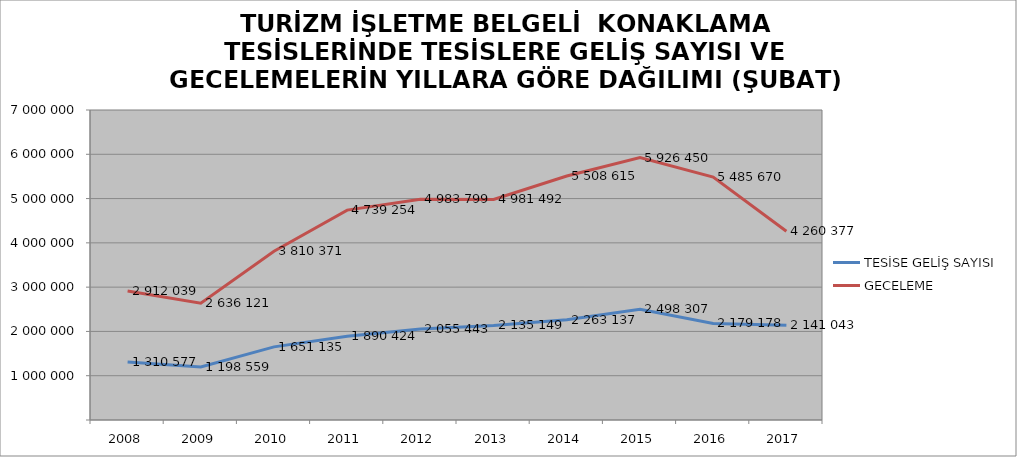
| Category | TESİSE GELİŞ SAYISI | GECELEME |
|---|---|---|
| 2008 | 1310577 | 2912039 |
| 2009 | 1198559 | 2636121 |
| 2010 | 1651135 | 3810371 |
| 2011 | 1890424 | 4739254 |
| 2012 | 2055443 | 4983799 |
| 2013 | 2135149 | 4981492 |
| 2014 | 2263137 | 5508615 |
| 2015 | 2498307 | 5926450 |
| 2016 | 2179178 | 5485670 |
| 2017 | 2141043 | 4260377 |